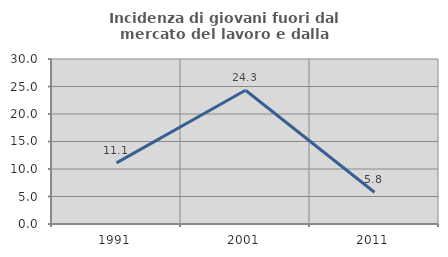
| Category | Incidenza di giovani fuori dal mercato del lavoro e dalla formazione  |
|---|---|
| 1991.0 | 11.111 |
| 2001.0 | 24.324 |
| 2011.0 | 5.769 |